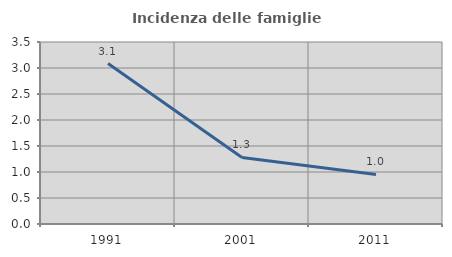
| Category | Incidenza delle famiglie numerose |
|---|---|
| 1991.0 | 3.086 |
| 2001.0 | 1.28 |
| 2011.0 | 0.952 |